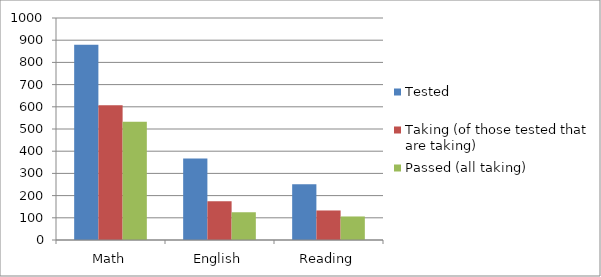
| Category | Tested | Taking (of those tested that are taking) | Passed (all taking) |
|---|---|---|---|
| Math | 879 | 607 | 533 |
| English | 367 | 175 | 125 |
| Reading | 251 | 133 | 106 |